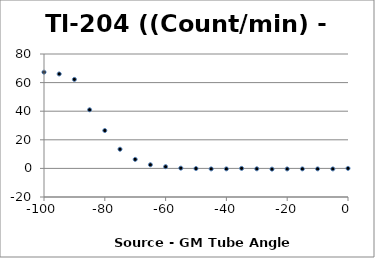
| Category | Series 0 |
|---|---|
| -100.0 | 67.274 |
| -95.0 | 66.049 |
| -90.0 | 62.232 |
| -85.0 | 40.991 |
| -80.0 | 26.483 |
| -75.0 | 13.401 |
| -70.0 | 6.308 |
| -65.0 | 2.543 |
| -60.0 | 1.204 |
| -55.0 | 0.168 |
| -50.0 | -0.097 |
| -45.0 | -0.335 |
| -40.0 | -0.33 |
| -35.0 | 0.004 |
| -30.0 | -0.281 |
| -25.0 | -0.516 |
| -20.0 | -0.383 |
| -15.0 | -0.342 |
| -10.0 | -0.334 |
| -5.0 | -0.356 |
| 0.0 | 0 |